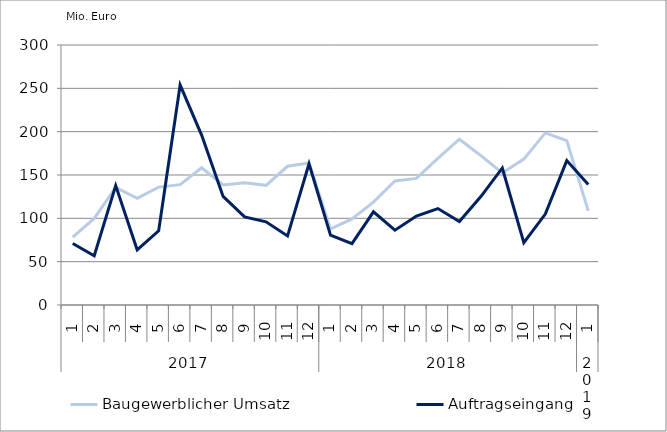
| Category | Baugewerblicher Umsatz | Auftragseingang |
|---|---|---|
| 0 | 78446.78 | 70908.903 |
| 1 | 99841.908 | 56868.408 |
| 2 | 135679.867 | 137790.423 |
| 3 | 123004.403 | 63637.761 |
| 4 | 136010.071 | 85644.63 |
| 5 | 138859.308 | 253791.552 |
| 6 | 158353.879 | 196034.198 |
| 7 | 138510.315 | 125319.873 |
| 8 | 141109.925 | 101690.626 |
| 9 | 138067.098 | 95966.626 |
| 10 | 160064.454 | 79701.993 |
| 11 | 163969.017 | 162878.607 |
| 12 | 87640.529 | 80684.627 |
| 13 | 99259.455 | 70746.763 |
| 14 | 118764.324 | 107538.747 |
| 15 | 143144.178 | 86374.619 |
| 16 | 146070.782 | 102661.329 |
| 17 | 169150.753 | 111287.709 |
| 18 | 191277.885 | 96286.662 |
| 19 | 172425.535 | 125142.495 |
| 20 | 152354.98 | 158112.302 |
| 21 | 168372.756 | 71808.619 |
| 22 | 198558.472 | 104904.147 |
| 23 | 189665.914 | 166653.461 |
| 24 | 108616.605 | 139065.287 |